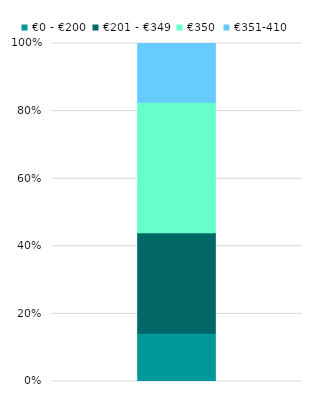
| Category | €0 - €200 | €201 - €349 | €350 | €351-410 |
|---|---|---|---|---|
| 0 | 0.143 | 0.297 | 0.386 | 0.174 |